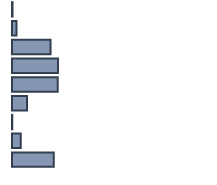
| Category | Series 0 |
|---|---|
| 0 | 0.259 |
| 1 | 2.233 |
| 2 | 19.183 |
| 3 | 22.881 |
| 4 | 22.73 |
| 5 | 7.415 |
| 6 | 0.13 |
| 7 | 4.394 |
| 8 | 20.775 |